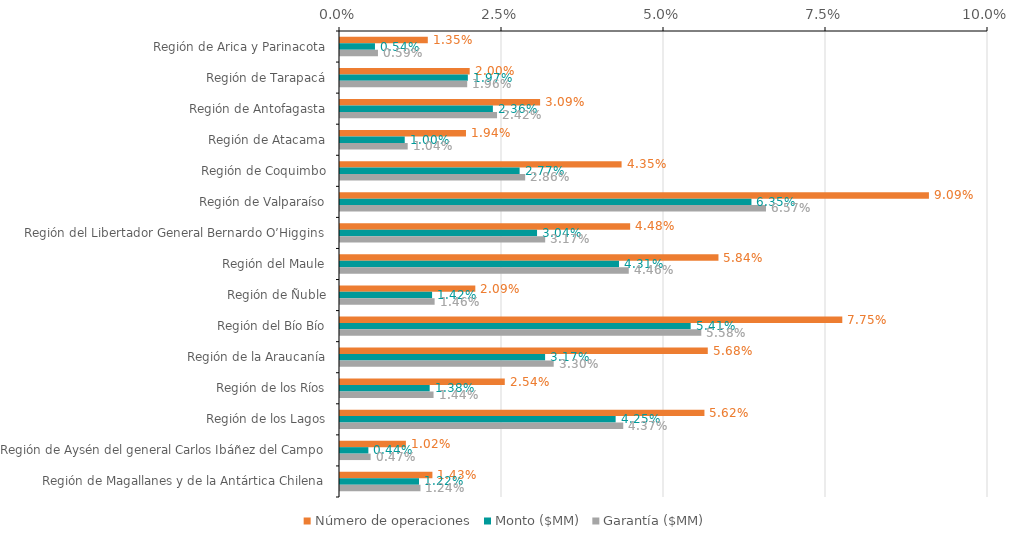
| Category | Número de operaciones | Monto ($MM) | Garantía ($MM) |
|---|---|---|---|
| Región de Arica y Parinacota | 0.014 | 0.005 | 0.006 |
| Región de Tarapacá | 0.02 | 0.02 | 0.02 |
| Región de Antofagasta | 0.031 | 0.024 | 0.024 |
| Región de Atacama | 0.019 | 0.01 | 0.01 |
| Región de Coquimbo | 0.043 | 0.028 | 0.029 |
| Región de Valparaíso | 0.091 | 0.063 | 0.066 |
| Región del Libertador General Bernardo O’Higgins | 0.045 | 0.03 | 0.032 |
| Región del Maule | 0.058 | 0.043 | 0.045 |
| Región de Ñuble | 0.021 | 0.014 | 0.015 |
| Región del Bío Bío | 0.078 | 0.054 | 0.056 |
| Región de la Araucanía | 0.057 | 0.032 | 0.033 |
| Región de los Ríos | 0.025 | 0.014 | 0.014 |
| Región de los Lagos | 0.056 | 0.043 | 0.044 |
| Región de Aysén del general Carlos Ibáñez del Campo | 0.01 | 0.004 | 0.005 |
| Región de Magallanes y de la Antártica Chilena | 0.014 | 0.012 | 0.012 |